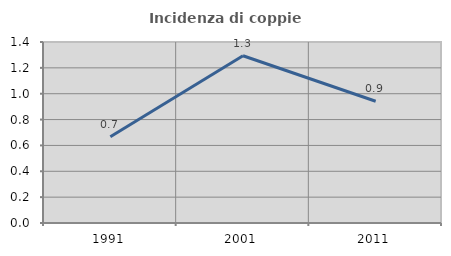
| Category | Incidenza di coppie miste |
|---|---|
| 1991.0 | 0.668 |
| 2001.0 | 1.294 |
| 2011.0 | 0.942 |